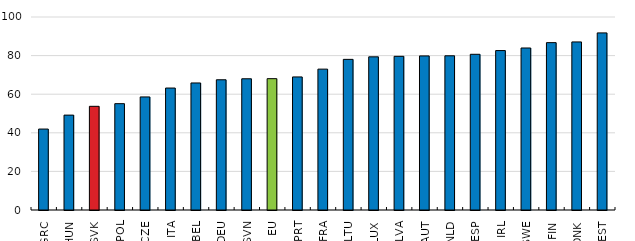
| Category | VALUE |
|---|---|
| GRC | 41.942 |
| HUN | 49.159 |
| SVK | 53.723 |
| POL | 55.1 |
| CZE | 58.589 |
| ITA | 63.194 |
| BEL | 65.826 |
| DEU | 67.474 |
| SVN | 67.994 |
| EU | 68.053 |
| PRT | 68.948 |
| FRA | 72.992 |
| LTU | 78.049 |
| LUX | 79.361 |
| LVA | 79.63 |
| AUT | 79.834 |
| NLD | 79.902 |
| ESP | 80.676 |
| IRL | 82.608 |
| SWE | 83.945 |
| FIN | 86.716 |
| DNK | 87.086 |
| EST | 91.763 |